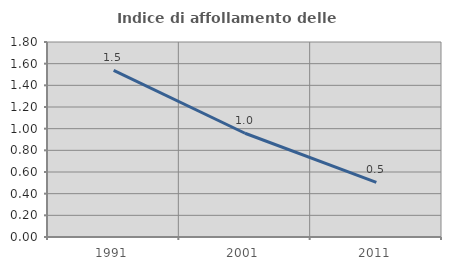
| Category | Indice di affollamento delle abitazioni  |
|---|---|
| 1991.0 | 1.538 |
| 2001.0 | 0.958 |
| 2011.0 | 0.503 |